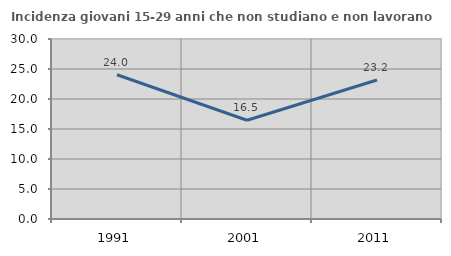
| Category | Incidenza giovani 15-29 anni che non studiano e non lavorano  |
|---|---|
| 1991.0 | 24.038 |
| 2001.0 | 16.463 |
| 2011.0 | 23.175 |